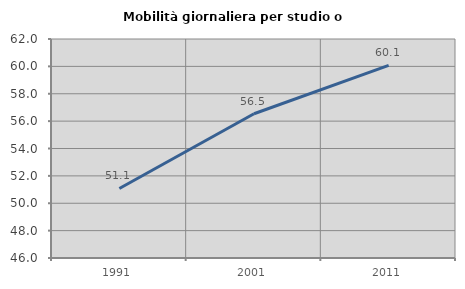
| Category | Mobilità giornaliera per studio o lavoro |
|---|---|
| 1991.0 | 51.08 |
| 2001.0 | 56.537 |
| 2011.0 | 60.068 |